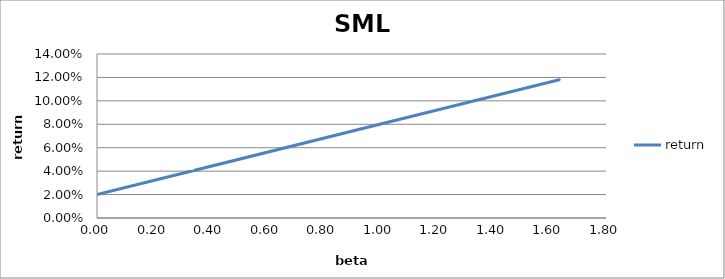
| Category | return |
|---|---|
| 0.34204678015857304 | 0.041 |
| 1.60632329470776 | 0.116 |
| 1.121071714088527 | 0.087 |
| 0.0 | 0.02 |
| 1.0 | 0.08 |